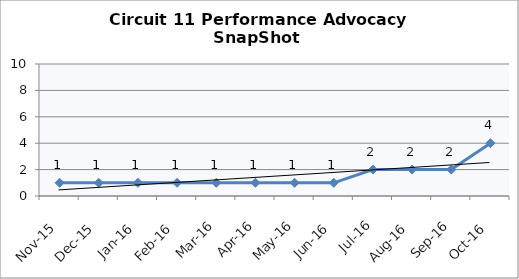
| Category | Circuit 11 |
|---|---|
| Nov-15 | 1 |
| Dec-15 | 1 |
| Jan-16 | 1 |
| Feb-16 | 1 |
| Mar-16 | 1 |
| Apr-16 | 1 |
| May-16 | 1 |
| Jun-16 | 1 |
| Jul-16 | 2 |
| Aug-16 | 2 |
| Sep-16 | 2 |
| Oct-16 | 4 |